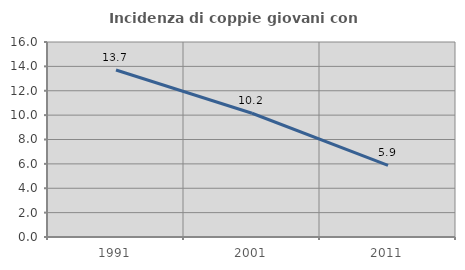
| Category | Incidenza di coppie giovani con figli |
|---|---|
| 1991.0 | 13.704 |
| 2001.0 | 10.155 |
| 2011.0 | 5.882 |